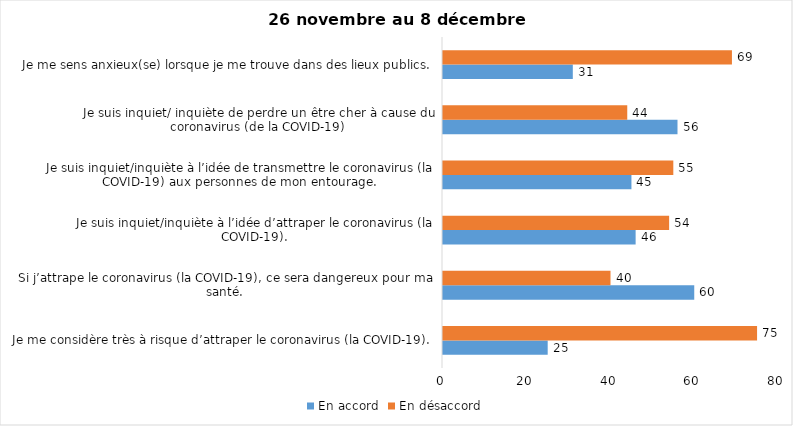
| Category | En accord | En désaccord |
|---|---|---|
| Je me considère très à risque d’attraper le coronavirus (la COVID-19). | 25 | 75 |
| Si j’attrape le coronavirus (la COVID-19), ce sera dangereux pour ma santé. | 60 | 40 |
| Je suis inquiet/inquiète à l’idée d’attraper le coronavirus (la COVID-19). | 46 | 54 |
| Je suis inquiet/inquiète à l’idée de transmettre le coronavirus (la COVID-19) aux personnes de mon entourage. | 45 | 55 |
| Je suis inquiet/ inquiète de perdre un être cher à cause du coronavirus (de la COVID-19) | 56 | 44 |
| Je me sens anxieux(se) lorsque je me trouve dans des lieux publics. | 31 | 69 |